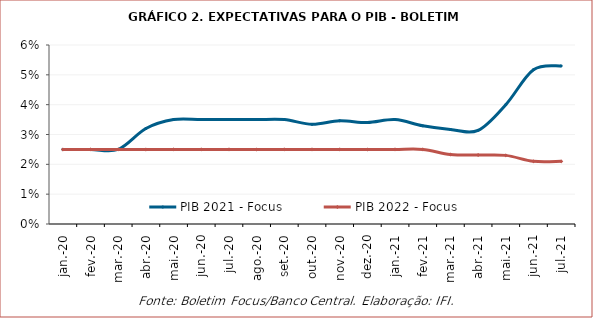
| Category | PIB 2021 - Focus | PIB 2022 - Focus |
|---|---|---|
| 2020-01-28 | 0.025 | 0.025 |
| 2020-02-28 | 0.025 | 0.025 |
| 2020-03-28 | 0.025 | 0.025 |
| 2020-04-28 | 0.032 | 0.025 |
| 2020-05-28 | 0.035 | 0.025 |
| 2020-06-28 | 0.035 | 0.025 |
| 2020-07-28 | 0.035 | 0.025 |
| 2020-08-28 | 0.035 | 0.025 |
| 2020-09-28 | 0.035 | 0.025 |
| 2020-10-28 | 0.033 | 0.025 |
| 2020-11-28 | 0.035 | 0.025 |
| 2020-12-28 | 0.034 | 0.025 |
| 2021-01-28 | 0.035 | 0.025 |
| 2021-02-28 | 0.033 | 0.025 |
| 2021-03-28 | 0.032 | 0.023 |
| 2021-04-28 | 0.031 | 0.023 |
| 2021-05-28 | 0.04 | 0.023 |
| 2021-06-28 | 0.052 | 0.021 |
| 2021-07-28 | 0.053 | 0.021 |